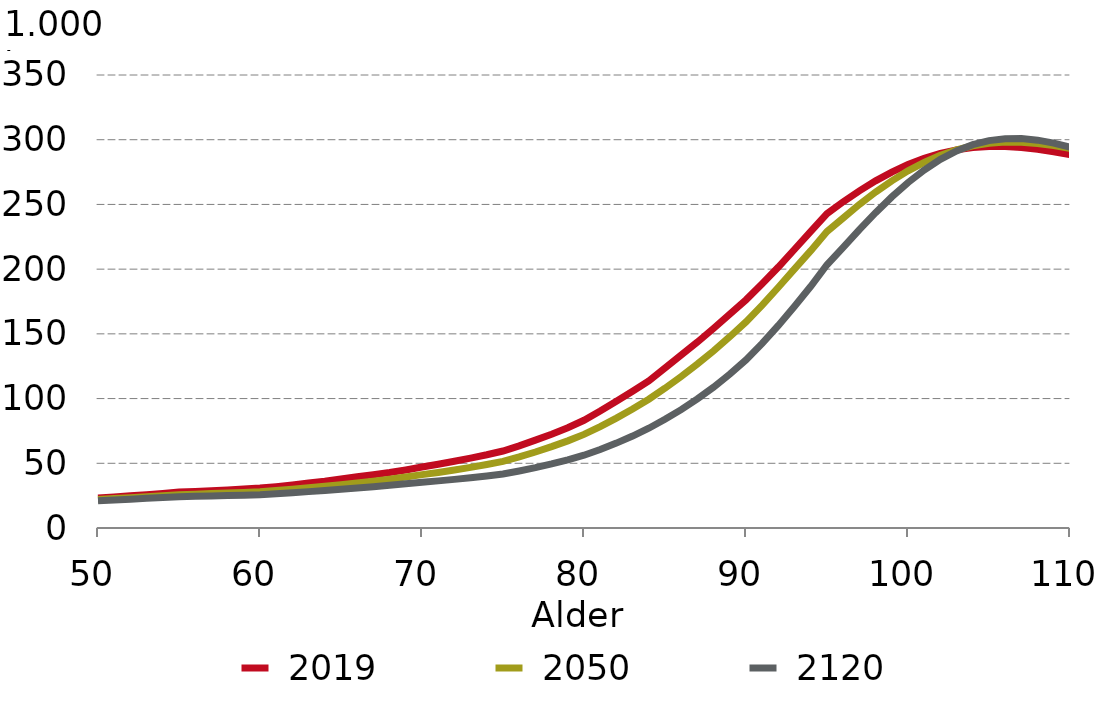
| Category |  2019 |  2050 |  2120 |
|---|---|---|---|
| 50.0 | 23.175 | 22.051 | 21.134 |
| 51.0 | 23.979 | 22.744 | 21.711 |
| 52.0 | 24.833 | 23.458 | 22.303 |
| 53.0 | 25.68 | 24.189 | 22.908 |
| 54.0 | 26.654 | 24.947 | 23.528 |
| 55.0 | 27.725 | 25.737 | 24.162 |
| 56.0 | 28.212 | 26.147 | 24.463 |
| 57.0 | 28.844 | 26.565 | 24.765 |
| 58.0 | 29.437 | 26.997 | 25.072 |
| 59.0 | 30.172 | 27.473 | 25.388 |
| 60.0 | 30.86 | 27.953 | 25.709 |
| 61.0 | 31.978 | 28.951 | 26.485 |
| 62.0 | 33.33 | 29.981 | 27.282 |
| 63.0 | 34.696 | 31.043 | 28.103 |
| 64.0 | 36.146 | 32.175 | 28.959 |
| 65.0 | 37.917 | 33.41 | 29.859 |
| 66.0 | 39.605 | 34.724 | 30.829 |
| 67.0 | 41.202 | 36.133 | 31.853 |
| 68.0 | 42.872 | 37.675 | 32.945 |
| 69.0 | 44.869 | 39.389 | 34.118 |
| 70.0 | 47.101 | 41.265 | 35.377 |
| 71.0 | 49.284 | 42.93 | 36.416 |
| 72.0 | 51.559 | 44.768 | 37.559 |
| 73.0 | 54.033 | 46.815 | 38.826 |
| 74.0 | 56.587 | 49.021 | 40.221 |
| 75.0 | 59.474 | 51.48 | 41.777 |
| 76.0 | 63.444 | 54.91 | 44.081 |
| 77.0 | 67.903 | 58.706 | 46.655 |
| 78.0 | 72.502 | 62.847 | 49.52 |
| 79.0 | 77.418 | 67.317 | 52.694 |
| 80.0 | 83.226 | 72.304 | 56.251 |
| 81.0 | 90.34 | 78.325 | 60.657 |
| 82.0 | 97.871 | 84.912 | 65.596 |
| 83.0 | 105.577 | 91.924 | 71.043 |
| 84.0 | 113.666 | 99.463 | 77.091 |
| 85.0 | 123.566 | 107.993 | 83.977 |
| 86.0 | 133.674 | 117.013 | 91.451 |
| 87.0 | 143.634 | 126.658 | 99.758 |
| 88.0 | 154.216 | 136.86 | 108.849 |
| 89.0 | 165.191 | 147.796 | 118.891 |
| 90.0 | 176.283 | 159.249 | 129.84 |
| 91.0 | 188.692 | 172.249 | 142.604 |
| 92.0 | 201.609 | 186.008 | 156.511 |
| 93.0 | 215.366 | 200.236 | 171.405 |
| 94.0 | 229.176 | 214.258 | 186.768 |
| 95.0 | 242.902 | 229.105 | 203.389 |
| 96.0 | 252.058 | 239.487 | 216.778 |
| 97.0 | 260.459 | 249.997 | 230.6 |
| 98.0 | 268.205 | 259.557 | 243.648 |
| 99.0 | 275.012 | 268.243 | 255.801 |
| 100.0 | 280.834 | 275.932 | 266.87 |
| 101.0 | 285.632 | 282.528 | 276.605 |
| 102.0 | 289.391 | 287.966 | 284.809 |
| 103.0 | 292.13 | 292.22 | 291.352 |
| 104.0 | 293.889 | 295.299 | 296.177 |
| 105.0 | 294.732 | 297.246 | 299.302 |
| 106.0 | 294.74 | 298.133 | 300.817 |
| 107.0 | 294.01 | 298.056 | 300.868 |
| 108.0 | 292.641 | 297.13 | 299.648 |
| 109.0 | 290.74 | 295.478 | 297.375 |
| 110.0 | 288.409 | 293.228 | 294.274 |